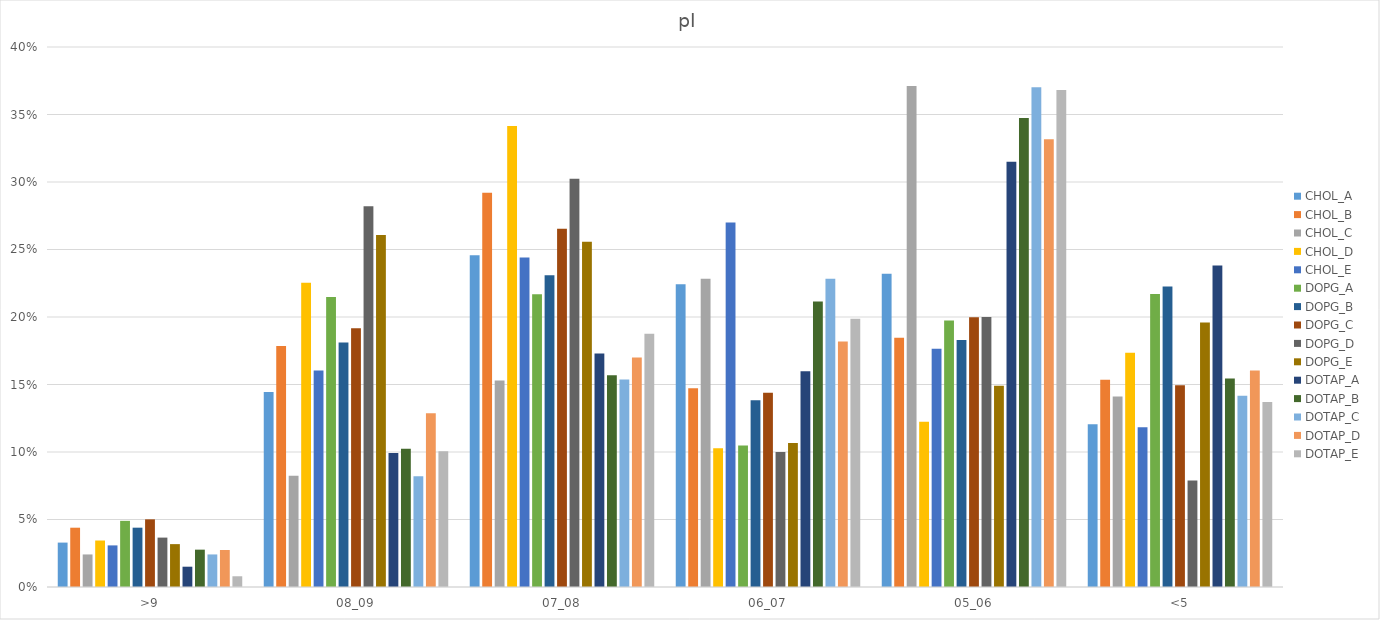
| Category | CHOL_A | CHOL_B | CHOL_C | CHOL_D | CHOL_E | DOPG_A | DOPG_B | DOPG_C | DOPG_D | DOPG_E | DOTAP_A | DOTAP_B | DOTAP_C | DOTAP_D | DOTAP_E |
|---|---|---|---|---|---|---|---|---|---|---|---|---|---|---|---|
| >9 | 0.033 | 0.044 | 0.024 | 0.034 | 0.031 | 0.049 | 0.044 | 0.05 | 0.037 | 0.032 | 0.015 | 0.028 | 0.024 | 0.027 | 0.008 |
| 08_09 | 0.144 | 0.178 | 0.082 | 0.225 | 0.16 | 0.215 | 0.181 | 0.192 | 0.282 | 0.261 | 0.099 | 0.102 | 0.082 | 0.129 | 0.101 |
| 07_08 | 0.246 | 0.292 | 0.153 | 0.341 | 0.244 | 0.217 | 0.231 | 0.265 | 0.302 | 0.256 | 0.173 | 0.157 | 0.154 | 0.17 | 0.188 |
| 06_07 | 0.224 | 0.147 | 0.228 | 0.103 | 0.27 | 0.105 | 0.138 | 0.144 | 0.1 | 0.107 | 0.16 | 0.211 | 0.228 | 0.182 | 0.199 |
| 05_06 | 0.232 | 0.185 | 0.371 | 0.122 | 0.176 | 0.197 | 0.183 | 0.2 | 0.2 | 0.149 | 0.315 | 0.347 | 0.37 | 0.332 | 0.368 |
| <5 | 0.121 | 0.154 | 0.141 | 0.173 | 0.118 | 0.217 | 0.223 | 0.149 | 0.079 | 0.196 | 0.238 | 0.154 | 0.142 | 0.16 | 0.137 |